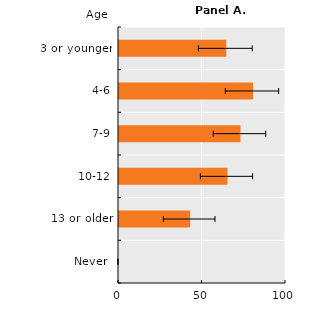
| Category | Series 0 |
|---|---|
| Never  | 0 |
| 13 or older | 42.622 |
| 10-12 | 64.974 |
| 7-9 | 72.731 |
| 4-6 | 80.233 |
| 3 or younger | 64.263 |